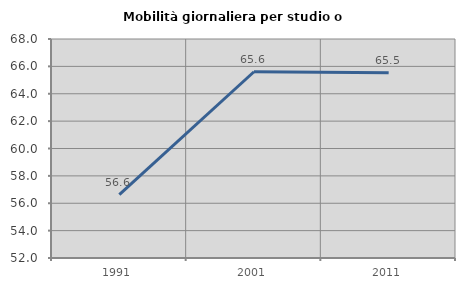
| Category | Mobilità giornaliera per studio o lavoro |
|---|---|
| 1991.0 | 56.637 |
| 2001.0 | 65.607 |
| 2011.0 | 65.528 |